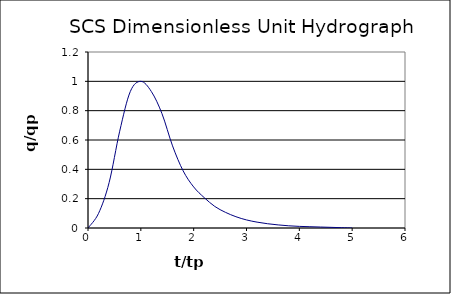
| Category | Series 0 |
|---|---|
| 0.0 | 0 |
| 0.2 | 0.1 |
| 0.4 | 0.31 |
| 0.6 | 0.66 |
| 0.8 | 0.93 |
| 1.0 | 1 |
| 1.2 | 0.93 |
| 1.4 | 0.78 |
| 1.6 | 0.56 |
| 1.8 | 0.39 |
| 2.0 | 0.28 |
| 2.2 | 0.207 |
| 2.4 | 0.147 |
| 2.6 | 0.107 |
| 2.8 | 0.077 |
| 3.0 | 0.055 |
| 3.2 | 0.04 |
| 3.4 | 0.029 |
| 3.6 | 0.021 |
| 3.8 | 0.015 |
| 4.0 | 0.011 |
| 4.2 | 0.009 |
| 4.4 | 0.007 |
| 4.6 | 0.004 |
| 4.8 | 0.002 |
| 5.0 | 0 |